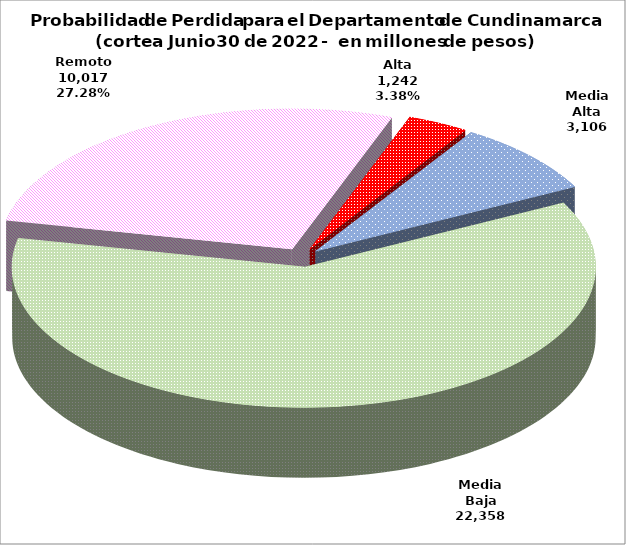
| Category | Series 0 |
|---|---|
| Alta | 1241.561 |
| Media Alta | 3105.877 |
| Media Baja | 22358.086 |
| Remoto | 10017.299 |